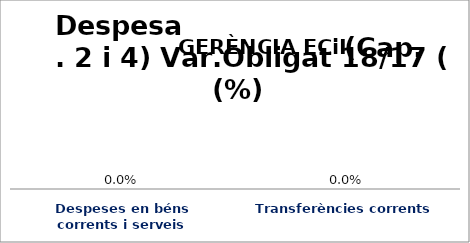
| Category | Series 0 |
|---|---|
| Despeses en béns corrents i serveis | 0 |
| Transferències corrents | 0 |